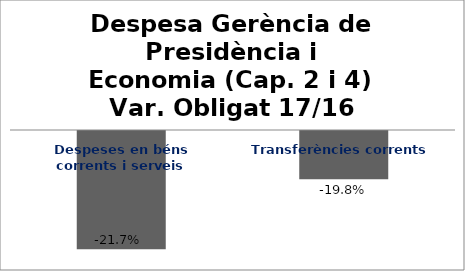
| Category | Series 0 |
|---|---|
| Despeses en béns corrents i serveis | -0.217 |
| Transferències corrents | -0.198 |